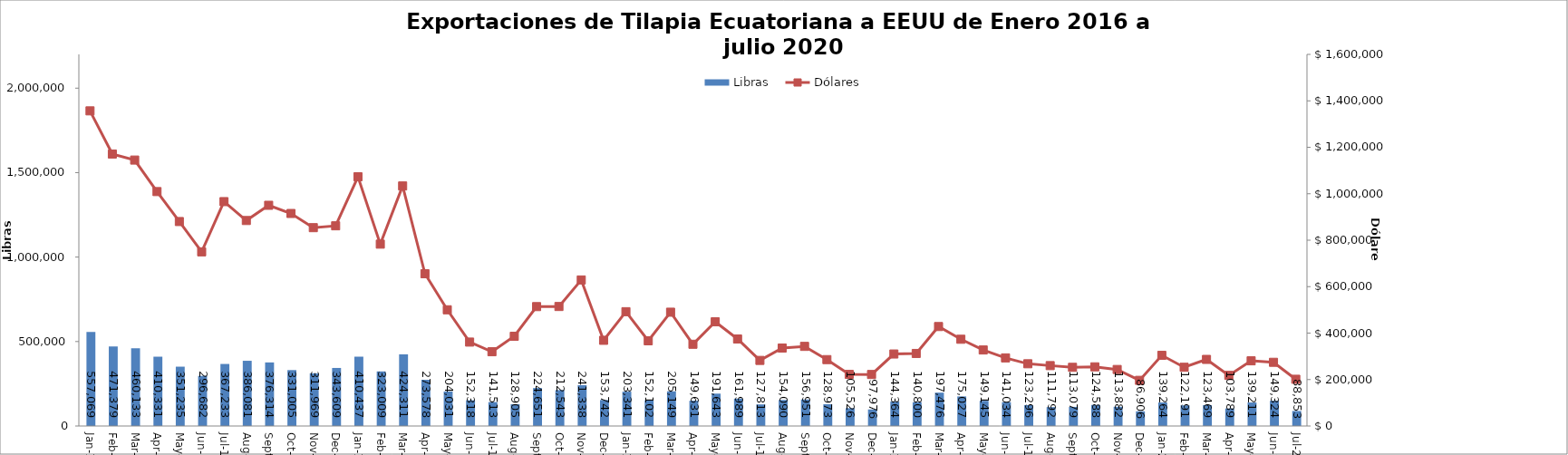
| Category | Libras  |
|---|---|
| 2016-01-01 | 557069.351 |
| 2016-02-01 | 471378.754 |
| 2016-03-01 | 460133.089 |
| 2016-04-01 | 410331.175 |
| 2016-05-01 | 351235 |
| 2016-06-01 | 296682 |
| 2016-07-01 | 367233.45 |
| 2016-08-01 | 386080.575 |
| 2016-09-01 | 376314.197 |
| 2016-10-01 | 331005.258 |
| 2016-11-01 | 311968.537 |
| 2016-12-01 | 343608.956 |
| 2017-01-01 | 410436.996 |
| 2017-02-01 | 323009.174 |
| 2017-03-01 | 424310.544 |
| 2017-04-01 | 273577.632 |
| 2017-05-01 | 204031.321 |
| 2017-06-01 | 152318.019 |
| 2017-07-01 | 141513.274 |
| 2017-08-01 | 128905.167 |
| 2017-09-01 | 224650.945 |
| 2017-10-01 | 212543.281 |
| 2017-11-01 | 241337.562 |
| 2017-12-01 | 153742.19 |
| 2018-01-01 | 203341.281 |
| 2018-02-01 | 152101.968 |
| 2018-03-01 | 205149.053 |
| 2018-04-01 | 149630.611 |
| 2018-05-01 | 191643 |
| 2018-06-01 | 161989 |
| 2018-07-01 | 127813 |
| 2018-08-01 | 154089.894 |
| 2018-09-01 | 156951.494 |
| 2018-10-01 | 128972.628 |
| 2018-11-01 | 105526.466 |
| 2018-12-01 | 97975.634 |
| 2019-01-01 | 144364.157 |
| 2019-02-01 | 140800 |
| 2019-03-01 | 197476 |
| 2019-04-01 | 175027.19 |
| 2019-05-01 | 149144.92 |
| 2019-06-01 | 141034.12 |
| 2019-07-01 | 123295.72 |
| 2019-08-01 | 111792 |
| 2019-09-01 | 113079.347 |
| 2019-10-01 | 124588.429 |
| 2019-11-01 | 113882.151 |
| 2019-12-01 | 86905.72 |
| 2020-01-01 | 139264.124 |
| 2020-02-01 | 122191.168 |
| 2020-03-01 | 123468.964 |
| 2020-04-01 | 103789.125 |
| 2020-05-01 | 139210.604 |
| 2020-06-01 | 149323.7 |
| 2020-07-01 | 88852.518 |